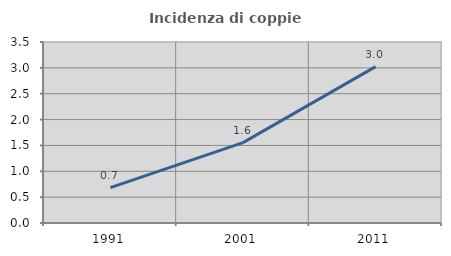
| Category | Incidenza di coppie miste |
|---|---|
| 1991.0 | 0.685 |
| 2001.0 | 1.554 |
| 2011.0 | 3.025 |